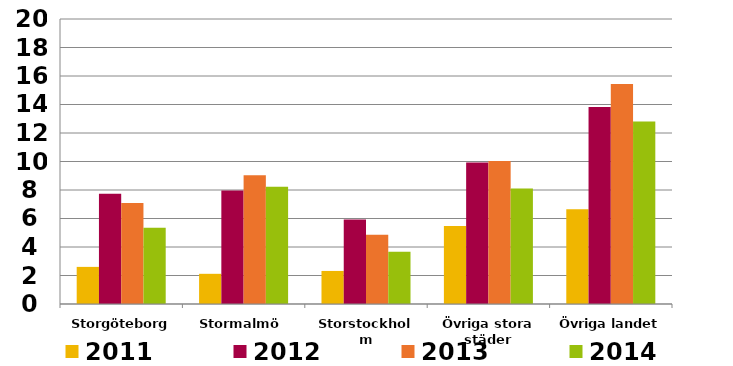
| Category | 2011 | 2012 | 2013 | 2014 |
|---|---|---|---|---|
| Storgöteborg | 2.605 | 7.731 | 7.09 | 5.351 |
| Stormalmö | 2.119 | 7.958 | 9.027 | 8.22 |
| Storstockholm | 2.32 | 5.933 | 4.858 | 3.663 |
| Övriga stora städer | 5.478 | 9.932 | 10.038 | 8.098 |
| Övriga landet | 6.658 | 13.828 | 15.443 | 12.802 |